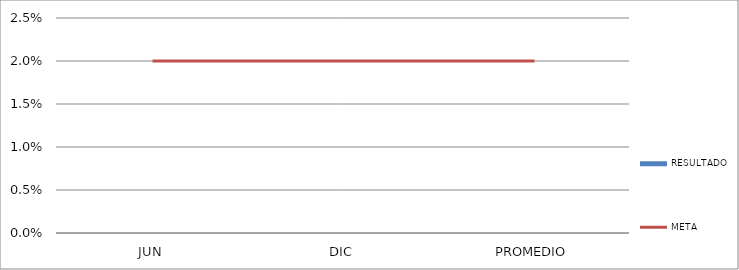
| Category | RESULTADO |
|---|---|
| JUN | 0 |
| DIC | 0 |
| PROMEDIO | 0 |